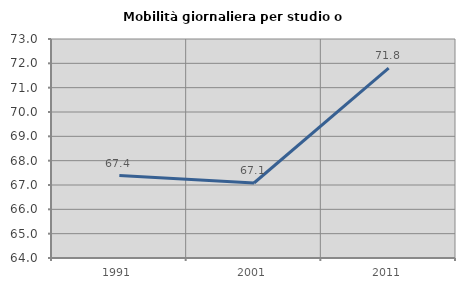
| Category | Mobilità giornaliera per studio o lavoro |
|---|---|
| 1991.0 | 67.387 |
| 2001.0 | 67.082 |
| 2011.0 | 71.803 |